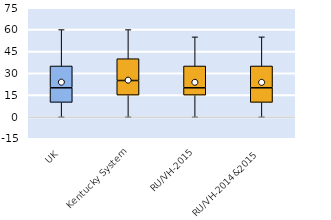
| Category | 25th | 50th | 75th |
|---|---|---|---|
| UK | 10 | 10 | 15 |
| Kentucky System | 15 | 10 | 15 |
| RU/VH-2015 | 15 | 5 | 15 |
| RU/VH-2014&2015 | 10 | 10 | 15 |